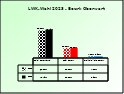
| Category | 2018 | 2023 |
|---|---|---|
| Bgld. Bauernbund | 0.688 | 0.708 |
| SPÖ Bauern | 0.25 | 0.253 |
| Freiheitliche Bauern | 0.043 | 0.039 |